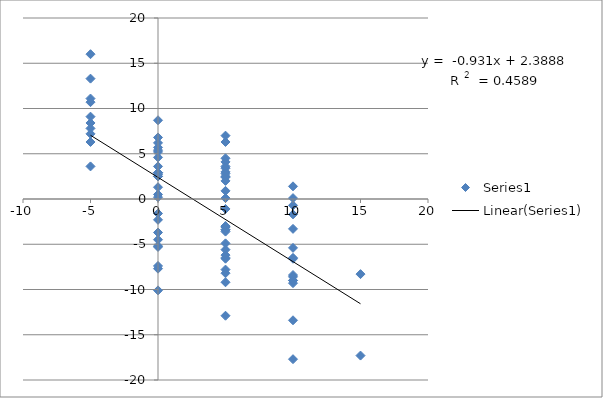
| Category | Series 0 |
|---|---|
| 5.0 | -3 |
| 0.0 | 5.7 |
| 5.0 | -7.8 |
| 0.0 | 3.6 |
| 5.0 | -3.4 |
| 0.0 | -2.3 |
| -5.0 | 13.3 |
| 0.0 | -10.1 |
| -5.0 | 16 |
| 0.0 | -3.7 |
| -5.0 | 6.3 |
| 0.0 | 2.9 |
| 5.0 | 6.3 |
| 10.0 | -9.3 |
| 5.0 | 2 |
| 10.0 | -9 |
| 5.0 | 7 |
| 10.0 | -5.4 |
| 5.0 | -9.2 |
| 0.0 | 2.9 |
| 5.0 | -4.9 |
| 0.0 | 6.2 |
| 5.0 | -6.6 |
| 0.0 | 2.9 |
| 5.0 | -3.4 |
| 0.0 | -4.5 |
| -5.0 | 7.8 |
| 0.0 | 0.2 |
| -5.0 | 3.6 |
| 0.0 | 2.5 |
| 5.0 | 4.5 |
| 10.0 | -6.5 |
| 5.0 | 0.9 |
| 10.0 | -9 |
| 5.0 | 3.4 |
| 10.0 | -8.6 |
| 5.0 | 2.4 |
| 10.0 | -1.7 |
| 5.0 | -1.1 |
| 0.0 | -7.7 |
| -5.0 | 10.7 |
| 0.0 | -5.2 |
| -5.0 | 8.4 |
| 0.0 | 5.4 |
| 5.0 | -6.5 |
| 0.0 | 8.7 |
| 5.0 | -5.6 |
| 0.0 | -1.6 |
| -5.0 | 7.2 |
| 0.0 | 2.7 |
| 5.0 | -3.1 |
| 0.0 | -5.3 |
| -5.0 | 11.1 |
| 0.0 | 1.3 |
| 5.0 | -3.6 |
| 0.0 | 6.8 |
| 5.0 | -8.2 |
| 0.0 | 0.5 |
| 5.0 | 2.5 |
| 10.0 | -6.6 |
| 5.0 | -3.1 |
| 0.0 | 4.6 |
| 5.0 | -6.2 |
| 0.0 | 2.5 |
| 5.0 | 2.8 |
| 10.0 | -13.4 |
| 5.0 | 3 |
| 10.0 | 1.4 |
| 15.0 | -8.3 |
| 10.0 | -17.7 |
| 5.0 | 4.1 |
| 10.0 | -0.7 |
| 5.0 | -12.9 |
| 0.0 | 5.2 |
| 5.0 | 0.1 |
| 10.0 | -8.4 |
| 5.0 | 3.6 |
| 10.0 | 0.1 |
| 15.0 | -17.3 |
| 10.0 | -3.3 |
| 5.0 | -3 |
| 0.0 | -7.4 |
| -5.0 | 9.1 |